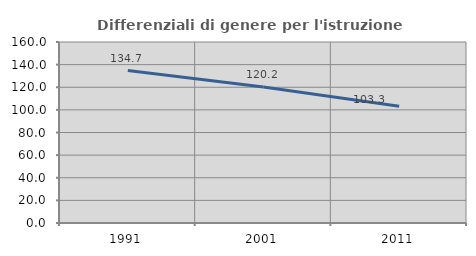
| Category | Differenziali di genere per l'istruzione superiore |
|---|---|
| 1991.0 | 134.706 |
| 2001.0 | 120.179 |
| 2011.0 | 103.268 |